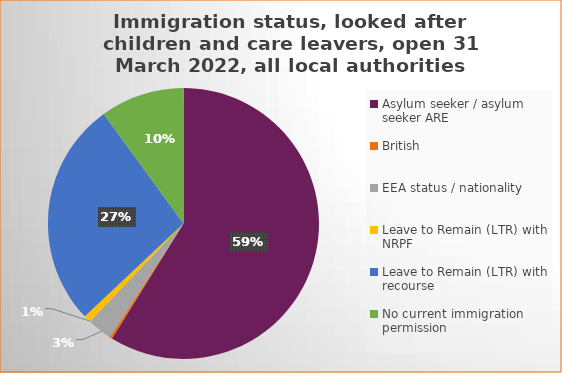
| Category | Number  | Percentage |
|---|---|---|
| Asylum seeker / asylum seeker ARE | 1698 | 0.589 |
| British | 9 | 0.003 |
| EEA status / nationality  | 86 | 0.03 |
| Leave to Remain (LTR) with NRPF | 24 | 0.008 |
| Leave to Remain (LTR) with recourse | 779 | 0.27 |
| No current immigration permission | 289 | 0.1 |